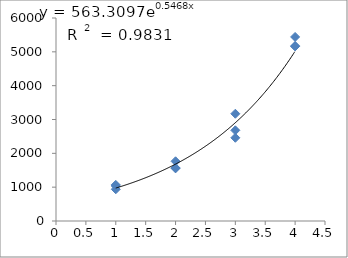
| Category | Series 0 |
|---|---|
| 1.0 | 938 |
| 1.0 | 1068 |
| 1.0 | 1036 |
| 2.0 | 1765 |
| 2.0 | 1555 |
| 2.0 | 1570 |
| 3.0 | 2460 |
| 3.0 | 3170 |
| 3.0 | 2680 |
| 4.0 | 5175 |
| 4.0 | 5440 |
| 4.0 | 5160 |